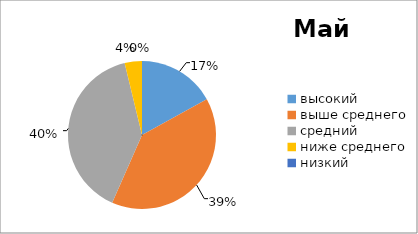
| Category | Series 0 |
|---|---|
| высокий  | 9 |
| выше среднего | 21 |
| средний | 21 |
| ниже среднего | 2 |
| низкий | 0 |